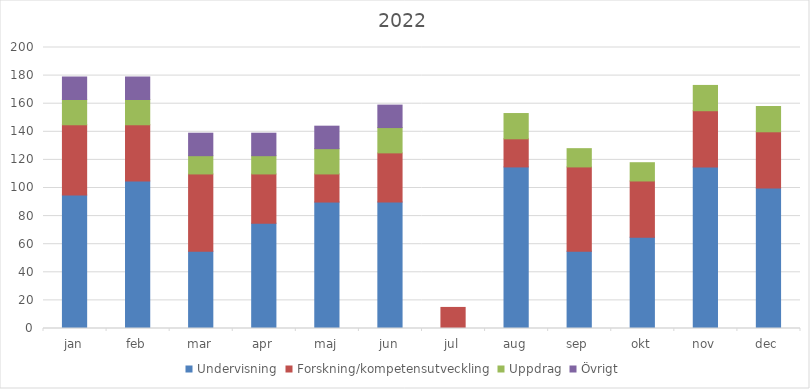
| Category | Undervisning | Forskning/kompetensutveckling | Uppdrag | Övrigt |
|---|---|---|---|---|
| jan | 95 | 50 | 18 | 16 |
| feb | 105 | 40 | 18 | 16 |
| mar | 55 | 55 | 13 | 16 |
| apr | 75 | 35 | 13 | 16 |
| maj | 90 | 20 | 18 | 16 |
| jun | 90 | 35 | 18 | 16 |
| jul | 0 | 15 | 0 | 0 |
| aug | 115 | 20 | 18 | 0 |
| sep | 55 | 60 | 13 | 0 |
| okt | 65 | 40 | 13 | 0 |
| nov | 115 | 40 | 18 | 0 |
| dec | 100 | 40 | 18 | 0 |